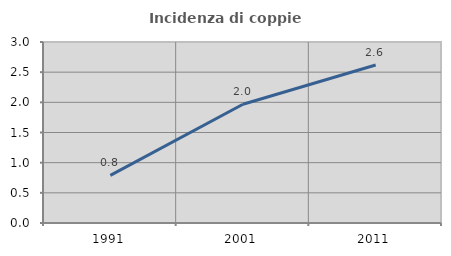
| Category | Incidenza di coppie miste |
|---|---|
| 1991.0 | 0.789 |
| 2001.0 | 1.969 |
| 2011.0 | 2.618 |